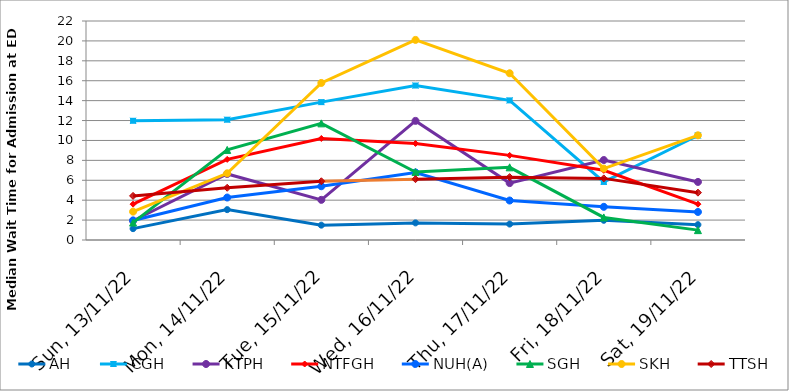
| Category | AH | CGH | KTPH | NTFGH | NUH(A) | SGH | SKH | TTSH |
|---|---|---|---|---|---|---|---|---|
| 2022-11-13 | 1.14 | 11.975 | 1.933 | 3.6 | 1.967 | 1.75 | 2.85 | 4.43 |
| 2022-11-14 | 3.05 | 12.083 | 6.633 | 8.1 | 4.267 | 9.05 | 6.7 | 5.245 |
| 2022-11-15 | 1.49 | 13.85 | 4.033 | 10.2 | 5.4 | 11.717 | 15.775 | 5.9 |
| 2022-11-16 | 1.72 | 15.517 | 11.967 | 9.7 | 6.783 | 6.825 | 20.1 | 6.11 |
| 2022-11-17 | 1.6 | 14.025 | 5.717 | 8.5 | 3.967 | 7.3 | 16.75 | 6.315 |
| 2022-11-18 | 1.98 | 5.833 | 8.033 | 7 | 3.333 | 2.267 | 7.175 | 6.19 |
| 2022-11-19 | 1.54 | 10.5 | 5.833 | 3.6 | 2.817 | 0.992 | 10.517 | 4.755 |